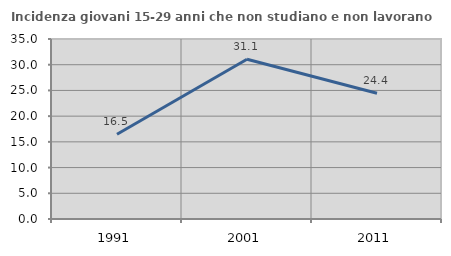
| Category | Incidenza giovani 15-29 anni che non studiano e non lavorano  |
|---|---|
| 1991.0 | 16.471 |
| 2001.0 | 31.062 |
| 2011.0 | 24.444 |